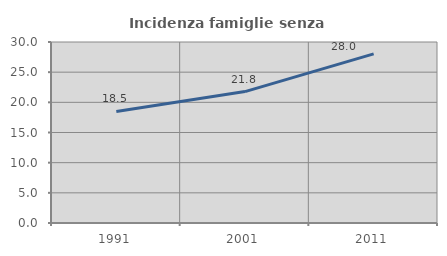
| Category | Incidenza famiglie senza nuclei |
|---|---|
| 1991.0 | 18.485 |
| 2001.0 | 21.784 |
| 2011.0 | 28.025 |